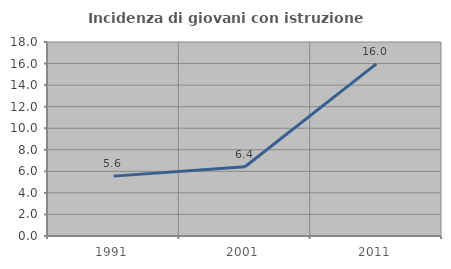
| Category | Incidenza di giovani con istruzione universitaria |
|---|---|
| 1991.0 | 5.556 |
| 2001.0 | 6.422 |
| 2011.0 | 15.972 |